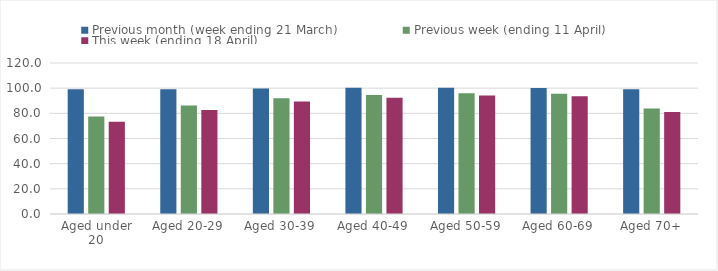
| Category | Previous month (week ending 21 March) | Previous week (ending 11 April) | This week (ending 18 April) |
|---|---|---|---|
| Aged under 20 | 99.173 | 77.518 | 73.308 |
| Aged 20-29 | 99.057 | 86.207 | 82.663 |
| Aged 30-39 | 99.788 | 91.98 | 89.345 |
| Aged 40-49 | 100.24 | 94.632 | 92.328 |
| Aged 50-59 | 100.362 | 95.998 | 94.08 |
| Aged 60-69 | 100.104 | 95.499 | 93.626 |
| Aged 70+ | 99.144 | 83.768 | 80.976 |